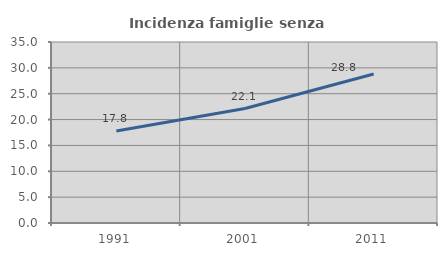
| Category | Incidenza famiglie senza nuclei |
|---|---|
| 1991.0 | 17.803 |
| 2001.0 | 22.129 |
| 2011.0 | 28.809 |